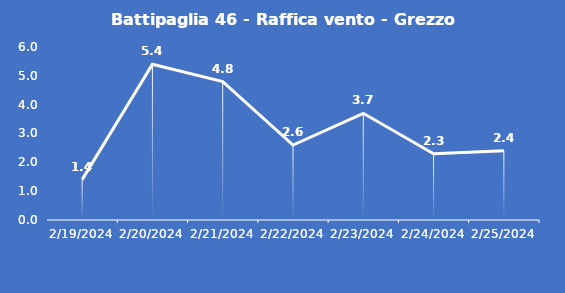
| Category | Battipaglia 46 - Raffica vento - Grezzo (m/s) |
|---|---|
| 2/19/24 | 1.4 |
| 2/20/24 | 5.4 |
| 2/21/24 | 4.8 |
| 2/22/24 | 2.6 |
| 2/23/24 | 3.7 |
| 2/24/24 | 2.3 |
| 2/25/24 | 2.4 |